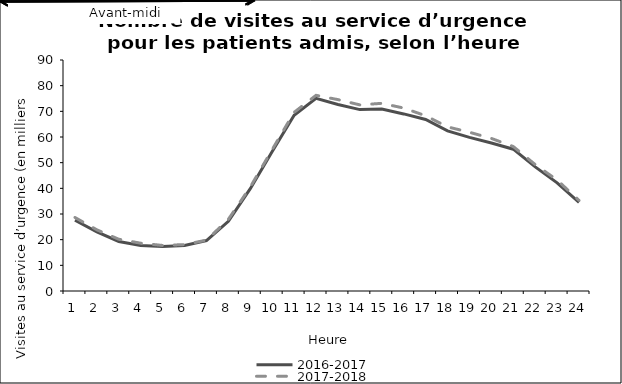
| Category | 2016-2017 | 2017-2018 |
|---|---|---|
| 0 | 27.568 | 28.65 |
| 1 | 23.032 | 23.834 |
| 2 | 19.297 | 20.163 |
| 3 | 17.768 | 18.625 |
| 4 | 17.361 | 17.748 |
| 5 | 17.742 | 18.085 |
| 6 | 19.641 | 19.803 |
| 7 | 27.175 | 27.938 |
| 8 | 39.857 | 40.537 |
| 9 | 54.344 | 55.119 |
| 10 | 68.494 | 69.621 |
| 11 | 75.068 | 76.24 |
| 12 | 72.675 | 74.566 |
| 13 | 70.67 | 72.508 |
| 14 | 70.915 | 73.125 |
| 15 | 68.993 | 71.276 |
| 16 | 66.837 | 68.282 |
| 17 | 62.356 | 63.941 |
| 18 | 59.856 | 61.847 |
| 19 | 57.642 | 59.444 |
| 20 | 55.246 | 56.285 |
| 21 | 48.362 | 49.251 |
| 22 | 42.149 | 43.238 |
| 23 | 34.49 | 35.307 |